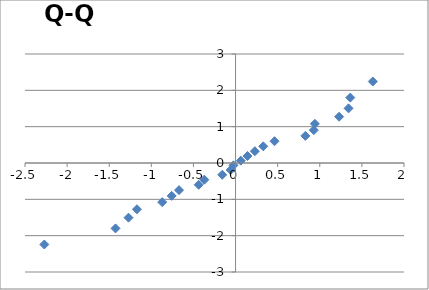
| Category | Series 0 |
|---|---|
| -2.270833333333334 | -2.243 |
| -1.4250000000000007 | -1.8 |
| -1.270833333333334 | -1.505 |
| -1.1708333333333325 | -1.274 |
| -0.8708333333333336 | -1.078 |
| -0.7583333333333329 | -0.905 |
| -0.6708333333333343 | -0.747 |
| -0.4375 | -0.599 |
| -0.37083333333333357 | -0.459 |
| -0.15833333333333321 | -0.325 |
| -0.058333333333331794 | -0.193 |
| -0.025000000000000355 | -0.064 |
| 0.062499999999998224 | 0.064 |
| 0.1416666666666675 | 0.193 |
| 0.22916666666666607 | 0.325 |
| 0.3291666666666657 | 0.459 |
| 0.4624999999999986 | 0.599 |
| 0.8291666666666657 | 0.747 |
| 0.9291666666666654 | 0.905 |
| 0.9416666666666664 | 1.078 |
| 1.2291666666666679 | 1.274 |
| 1.3416666666666668 | 1.505 |
| 1.362499999999999 | 1.8 |
| 1.6291666666666664 | 2.243 |